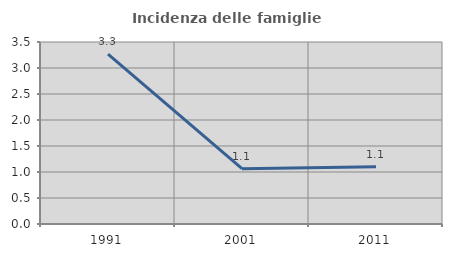
| Category | Incidenza delle famiglie numerose |
|---|---|
| 1991.0 | 3.267 |
| 2001.0 | 1.065 |
| 2011.0 | 1.1 |